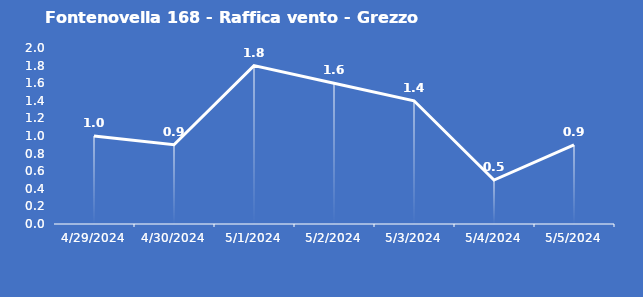
| Category | Fontenovella 168 - Raffica vento - Grezzo (m/s) |
|---|---|
| 4/29/24 | 1 |
| 4/30/24 | 0.9 |
| 5/1/24 | 1.8 |
| 5/2/24 | 1.6 |
| 5/3/24 | 1.4 |
| 5/4/24 | 0.5 |
| 5/5/24 | 0.9 |